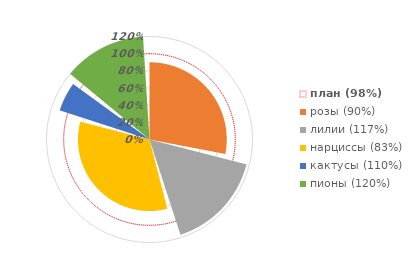
| Category | план (98%) | розы (90%) | лилии (117%) | нарциссы (83%) | кактусы (110%) | пионы (120%) |
|---|---|---|---|---|---|---|
| 1.0 | 1 | 0.9 | 0 | 0 | 0 | 0 |
| 2.0 | 1 | 0.9 | 0 | 0 | 0 | 0 |
| 3.0 | 1 | 0.9 | 0 | 0 | 0 | 0 |
| 4.0 | 1 | 0.9 | 0 | 0 | 0 | 0 |
| 5.0 | 1 | 0.9 | 0 | 0 | 0 | 0 |
| 6.0 | 1 | 0.9 | 0 | 0 | 0 | 0 |
| 7.0 | 1 | 0.9 | 0 | 0 | 0 | 0 |
| 8.0 | 1 | 0.9 | 0 | 0 | 0 | 0 |
| 9.0 | 1 | 0.9 | 0 | 0 | 0 | 0 |
| 10.0 | 1 | 0.9 | 0 | 0 | 0 | 0 |
| 11.0 | 1 | 0.9 | 0 | 0 | 0 | 0 |
| 12.0 | 1 | 0.9 | 0 | 0 | 0 | 0 |
| 13.0 | 1 | 0.9 | 0 | 0 | 0 | 0 |
| 14.0 | 1 | 0.9 | 0 | 0 | 0 | 0 |
| 15.0 | 1 | 0.9 | 0 | 0 | 0 | 0 |
| 16.0 | 1 | 0.9 | 0 | 0 | 0 | 0 |
| 17.0 | 1 | 0.9 | 0 | 0 | 0 | 0 |
| 18.0 | 1 | 0.9 | 0 | 0 | 0 | 0 |
| 19.0 | 1 | 0.9 | 0 | 0 | 0 | 0 |
| 20.0 | 1 | 0.9 | 0 | 0 | 0 | 0 |
| 21.0 | 1 | 0.9 | 0 | 0 | 0 | 0 |
| 22.0 | 1 | 0.9 | 0 | 0 | 0 | 0 |
| 23.0 | 1 | 0.9 | 0 | 0 | 0 | 0 |
| 24.0 | 1 | 0.9 | 0 | 0 | 0 | 0 |
| 25.0 | 1 | 0.9 | 0 | 0 | 0 | 0 |
| 26.0 | 1 | 0.9 | 0 | 0 | 0 | 0 |
| 27.0 | 1 | 0.9 | 0 | 0 | 0 | 0 |
| 28.0 | 1 | 0.9 | 0 | 0 | 0 | 0 |
| 29.0 | 1 | 0.9 | 0 | 0 | 0 | 0 |
| 30.0 | 1 | 0 | 1.167 | 0 | 0 | 0 |
| 31.0 | 1 | 0 | 1.167 | 0 | 0 | 0 |
| 32.0 | 1 | 0 | 1.167 | 0 | 0 | 0 |
| 33.0 | 1 | 0 | 1.167 | 0 | 0 | 0 |
| 34.0 | 1 | 0 | 1.167 | 0 | 0 | 0 |
| 35.0 | 1 | 0 | 1.167 | 0 | 0 | 0 |
| 36.0 | 1 | 0 | 1.167 | 0 | 0 | 0 |
| 37.0 | 1 | 0 | 1.167 | 0 | 0 | 0 |
| 38.0 | 1 | 0 | 1.167 | 0 | 0 | 0 |
| 39.0 | 1 | 0 | 1.167 | 0 | 0 | 0 |
| 40.0 | 1 | 0 | 1.167 | 0 | 0 | 0 |
| 41.0 | 1 | 0 | 1.167 | 0 | 0 | 0 |
| 42.0 | 1 | 0 | 1.167 | 0 | 0 | 0 |
| 43.0 | 1 | 0 | 1.167 | 0 | 0 | 0 |
| 44.0 | 1 | 0 | 1.167 | 0 | 0 | 0 |
| 45.0 | 1 | 0 | 1.167 | 0 | 0 | 0 |
| 46.0 | 1 | 0 | 1.167 | 0 | 0 | 0 |
| 47.0 | 1 | 0 | 0 | 0.833 | 0 | 0 |
| 48.0 | 1 | 0 | 0 | 0.833 | 0 | 0 |
| 49.0 | 1 | 0 | 0 | 0.833 | 0 | 0 |
| 50.0 | 1 | 0 | 0 | 0.833 | 0 | 0 |
| 51.0 | 1 | 0 | 0 | 0.833 | 0 | 0 |
| 52.0 | 1 | 0 | 0 | 0.833 | 0 | 0 |
| 53.0 | 1 | 0 | 0 | 0.833 | 0 | 0 |
| 54.0 | 1 | 0 | 0 | 0.833 | 0 | 0 |
| 55.0 | 1 | 0 | 0 | 0.833 | 0 | 0 |
| 56.0 | 1 | 0 | 0 | 0.833 | 0 | 0 |
| 57.0 | 1 | 0 | 0 | 0.833 | 0 | 0 |
| 58.0 | 1 | 0 | 0 | 0.833 | 0 | 0 |
| 59.0 | 1 | 0 | 0 | 0.833 | 0 | 0 |
| 60.0 | 1 | 0 | 0 | 0.833 | 0 | 0 |
| 61.0 | 1 | 0 | 0 | 0.833 | 0 | 0 |
| 62.0 | 1 | 0 | 0 | 0.833 | 0 | 0 |
| 63.0 | 1 | 0 | 0 | 0.833 | 0 | 0 |
| 64.0 | 1 | 0 | 0 | 0.833 | 0 | 0 |
| 65.0 | 1 | 0 | 0 | 0.833 | 0 | 0 |
| 66.0 | 1 | 0 | 0 | 0.833 | 0 | 0 |
| 67.0 | 1 | 0 | 0 | 0.833 | 0 | 0 |
| 68.0 | 1 | 0 | 0 | 0.833 | 0 | 0 |
| 69.0 | 1 | 0 | 0 | 0.833 | 0 | 0 |
| 70.0 | 1 | 0 | 0 | 0.833 | 0 | 0 |
| 71.0 | 1 | 0 | 0 | 0.833 | 0 | 0 |
| 72.0 | 1 | 0 | 0 | 0.833 | 0 | 0 |
| 73.0 | 1 | 0 | 0 | 0.833 | 0 | 0 |
| 74.0 | 1 | 0 | 0 | 0.833 | 0 | 0 |
| 75.0 | 1 | 0 | 0 | 0.833 | 0 | 0 |
| 76.0 | 1 | 0 | 0 | 0.833 | 0 | 0 |
| 77.0 | 1 | 0 | 0 | 0.833 | 0 | 0 |
| 78.0 | 1 | 0 | 0 | 0.833 | 0 | 0 |
| 79.0 | 1 | 0 | 0 | 0.833 | 0 | 0 |
| 80.0 | 1 | 0 | 0 | 0.833 | 0 | 0 |
| 81.0 | 1 | 0 | 0 | 0 | 1.1 | 0 |
| 82.0 | 1 | 0 | 0 | 0 | 1.1 | 0 |
| 83.0 | 1 | 0 | 0 | 0 | 1.1 | 0 |
| 84.0 | 1 | 0 | 0 | 0 | 1.1 | 0 |
| 85.0 | 1 | 0 | 0 | 0 | 1.1 | 0 |
| 86.0 | 1 | 0 | 0 | 0 | 1.1 | 0 |
| 87.0 | 1 | 0 | 0 | 0 | 0 | 1.2 |
| 88.0 | 1 | 0 | 0 | 0 | 0 | 1.2 |
| 89.0 | 1 | 0 | 0 | 0 | 0 | 1.2 |
| 90.0 | 1 | 0 | 0 | 0 | 0 | 1.2 |
| 91.0 | 1 | 0 | 0 | 0 | 0 | 1.2 |
| 92.0 | 1 | 0 | 0 | 0 | 0 | 1.2 |
| 93.0 | 1 | 0 | 0 | 0 | 0 | 1.2 |
| 94.0 | 1 | 0 | 0 | 0 | 0 | 1.2 |
| 95.0 | 1 | 0 | 0 | 0 | 0 | 1.2 |
| 96.0 | 1 | 0 | 0 | 0 | 0 | 1.2 |
| 97.0 | 1 | 0 | 0 | 0 | 0 | 1.2 |
| 98.0 | 1 | 0 | 0 | 0 | 0 | 1.2 |
| 99.0 | 1 | 0 | 0 | 0 | 0 | 1.2 |
| 100.0 | 1 | 0 | 0 | 0 | 0 | 1.2 |